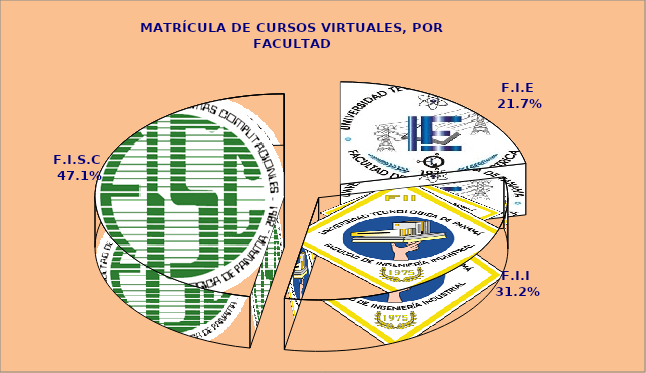
| Category | Series 0 |
|---|---|
| 0 | 60 |
| 1 | 86 |
| 2 | 130 |